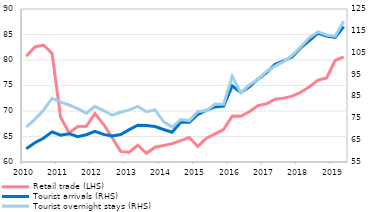
| Category | Retail trade (LHS) |
|---|---|
| 2010 | 80.735 |
| II | 82.561 |
| III | 82.932 |
| IV | 81.311 |
| 2011 | 68.78 |
| II | 65.697 |
| III | 66.973 |
| IV | 66.991 |
| 2012 | 69.484 |
| II | 67.398 |
| III | 64.804 |
| IV | 62.079 |
| 2013 | 61.944 |
| II | 63.289 |
| III | 61.711 |
| IV | 62.908 |
| 2014 | 63.241 |
| II | 63.606 |
| III | 64.175 |
| IV | 64.792 |
| 2015 | 63.054 |
| II | 64.659 |
| III | 65.507 |
| IV | 66.382 |
| 2016 | 69.004 |
| II | 68.963 |
| III | 69.851 |
| IV | 71.056 |
| 2017 | 71.429 |
| II | 72.321 |
| III | 72.521 |
| IV | 72.909 |
| 2018 | 73.669 |
| II | 74.753 |
| III | 76.047 |
| IV | 76.483 |
| 2019 | 79.898 |
| II | 80.601 |